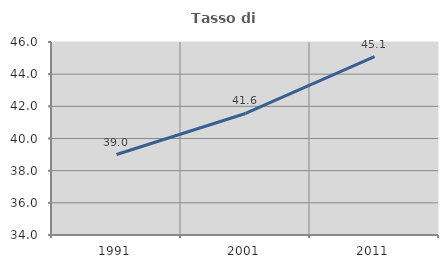
| Category | Tasso di occupazione   |
|---|---|
| 1991.0 | 39.002 |
| 2001.0 | 41.555 |
| 2011.0 | 45.089 |